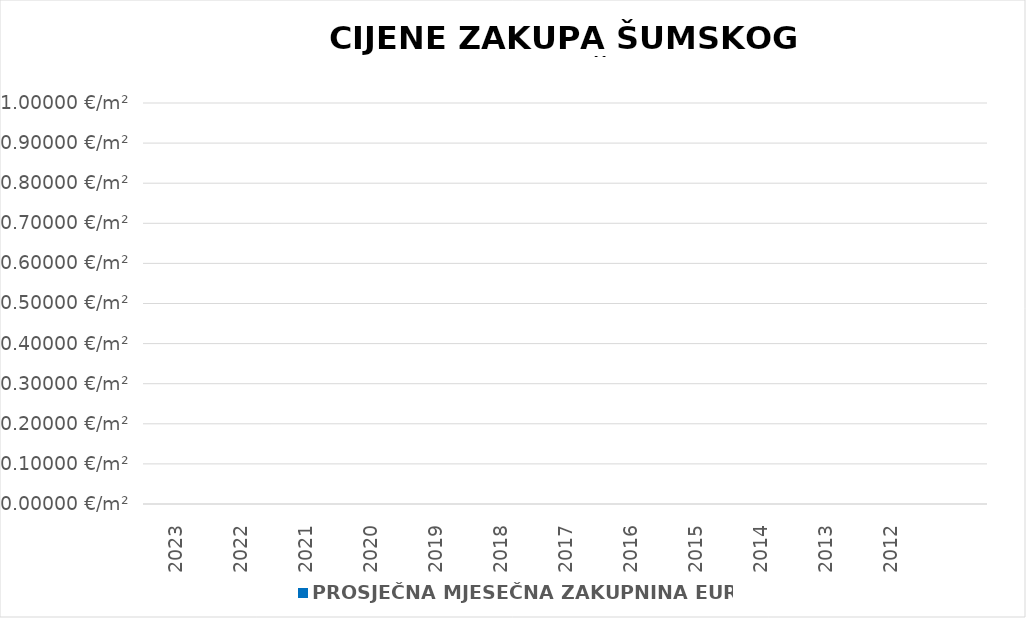
| Category | PROSJEČNA MJESEČNA ZAKUPNINA EUR/m2 |
|---|---|
| 2023 | 0 |
| 2022 | 0 |
| 2021 | 0 |
| 2020 | 0 |
| 2019 | 0 |
| 2018 | 0 |
| 2017 | 0 |
| 2016 | 0 |
| 2015 | 0 |
| 2014 | 0 |
| 2013 | 0 |
| 2012 | 0 |